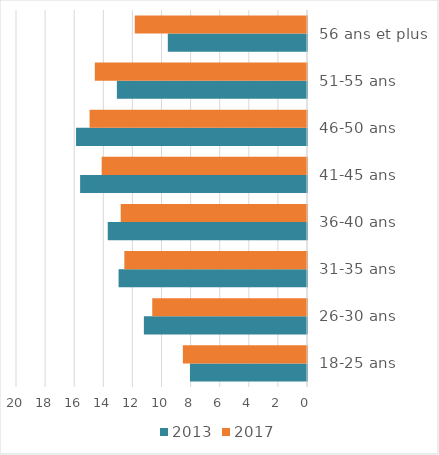
| Category | 2013 | 2017 |
|---|---|---|
| 18-25 ans | 8.045 | 8.531 |
| 26-30 ans | 11.211 | 10.635 |
| 31-35 ans | 12.95 | 12.553 |
| 36-40 ans | 13.694 | 12.804 |
| 41-45 ans | 15.593 | 14.112 |
| 46-50 ans | 15.875 | 14.945 |
| 51-55 ans | 13.067 | 14.582 |
| 56 ans et plus | 9.566 | 11.837 |